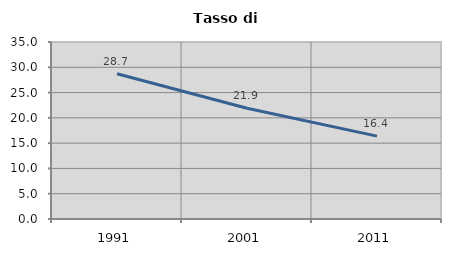
| Category | Tasso di disoccupazione   |
|---|---|
| 1991.0 | 28.734 |
| 2001.0 | 21.911 |
| 2011.0 | 16.388 |